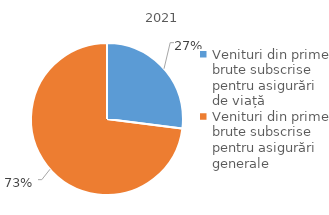
| Category | 2021 |
|---|---|
| Venituri din prime brute subscrise pentru asigurări de viață | 27 |
| Venituri din prime brute subscrise pentru asigurări generale | 73 |